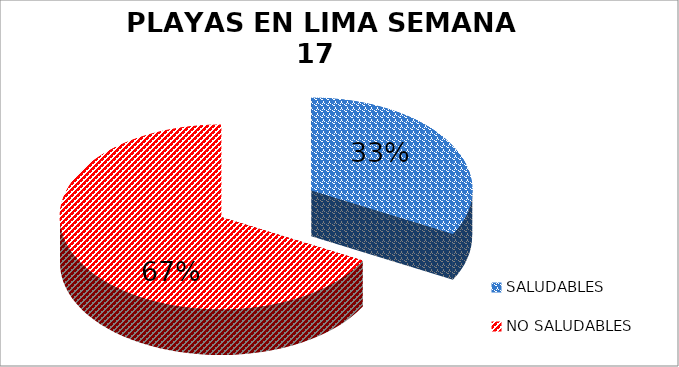
| Category | N.° |
|---|---|
| SALUDABLES | 23 |
| NO SALUDABLES | 47 |